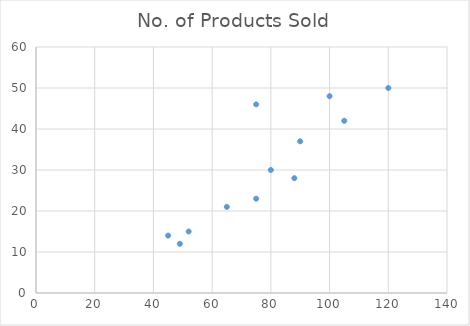
| Category | No. of Products Sold |
|---|---|
| 52.0 | 15 |
| 49.0 | 12 |
| 88.0 | 28 |
| 75.0 | 23 |
| 120.0 | 50 |
| 100.0 | 48 |
| 90.0 | 37 |
| 65.0 | 21 |
| 105.0 | 42 |
| 45.0 | 14 |
| 80.0 | 30 |
| 75.0 | 46 |